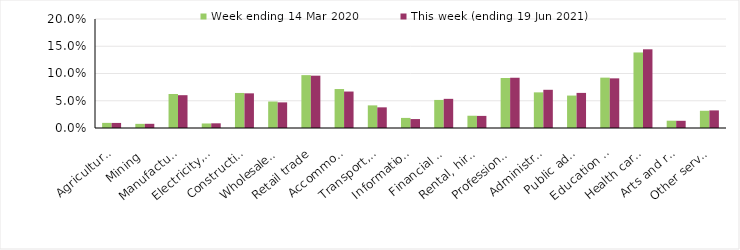
| Category | Week ending 14 Mar 2020 | This week (ending 19 Jun 2021) |
|---|---|---|
| Agriculture, forestry and fishing | 0.009 | 0.009 |
| Mining | 0.008 | 0.008 |
| Manufacturing | 0.062 | 0.06 |
| Electricity, gas, water and waste services | 0.008 | 0.009 |
| Construction | 0.064 | 0.064 |
| Wholesale trade | 0.049 | 0.047 |
| Retail trade | 0.097 | 0.096 |
| Accommodation and food services | 0.072 | 0.067 |
| Transport, postal and warehousing | 0.042 | 0.038 |
| Information media and telecommunications | 0.018 | 0.016 |
| Financial and insurance services | 0.052 | 0.054 |
| Rental, hiring and real estate services | 0.022 | 0.022 |
| Professional, scientific and technical services | 0.092 | 0.092 |
| Administrative and support services | 0.065 | 0.07 |
| Public administration and safety | 0.06 | 0.064 |
| Education and training | 0.092 | 0.091 |
| Health care and social assistance | 0.139 | 0.144 |
| Arts and recreation services | 0.013 | 0.013 |
| Other services | 0.032 | 0.032 |